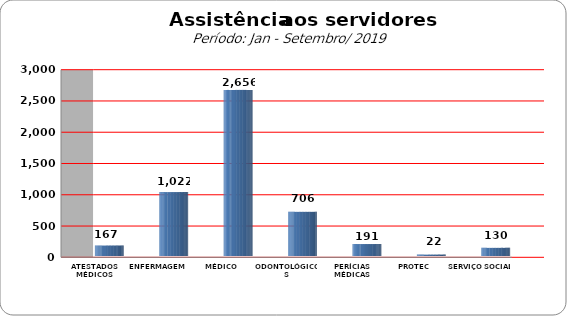
| Category | Series 0 |
|---|---|
| ATESTADOS MÉDICOS | 167 |
| ENFERMAGEM | 1022 |
| MÉDICO | 2656 |
| ODONTOLÓGICOS | 706 |
| PERÍCIAS MÉDICAS | 191 |
| PROTEC | 22 |
| SERVIÇO SOCIAL | 130 |